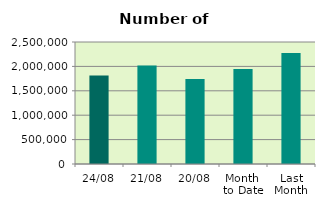
| Category | Series 0 |
|---|---|
| 24/08 | 1814684 |
| 21/08 | 2015956 |
| 20/08 | 1739738 |
| Month 
to Date | 1946995.625 |
| Last
Month | 2275631.565 |